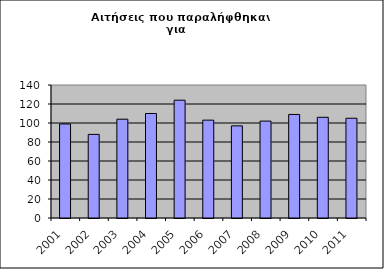
| Category | Series 1 |
|---|---|
| 2001.0 | 99 |
| 2002.0 | 88 |
| 2003.0 | 104 |
| 2004.0 | 110 |
| 2005.0 | 124 |
| 2006.0 | 103 |
| 2007.0 | 97 |
| 2008.0 | 102 |
| 2009.0 | 109 |
| 2010.0 | 106 |
| 2011.0 | 105 |